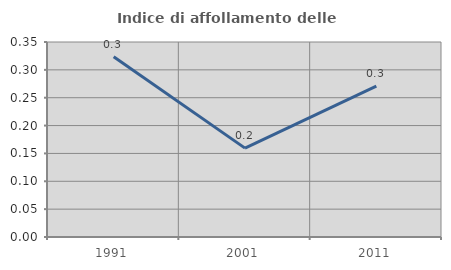
| Category | Indice di affollamento delle abitazioni  |
|---|---|
| 1991.0 | 0.324 |
| 2001.0 | 0.159 |
| 2011.0 | 0.271 |